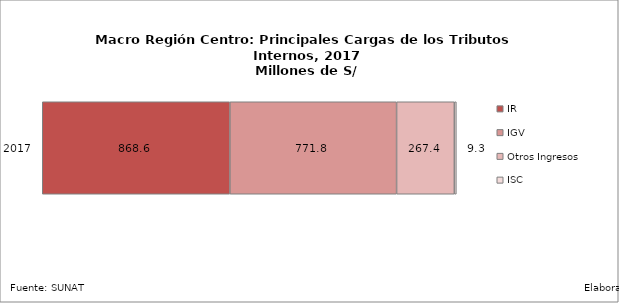
| Category | IR | IGV | Otros Ingresos | ISC |
|---|---|---|---|---|
| 2017.0 | 868.623 | 771.843 | 267.417 | 9.282 |